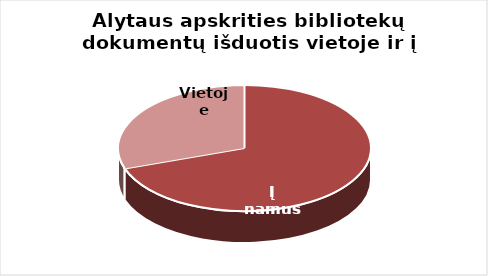
| Category | Series 0 |
|---|---|
| Į namus | 563007 |
| Vietoje | 243703 |